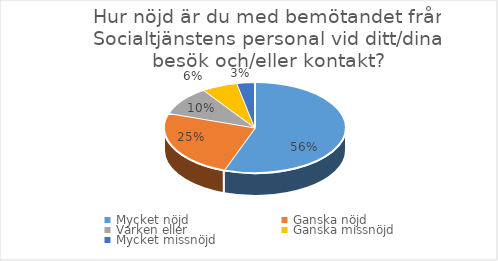
| Category | Series 0 |
|---|---|
| Mycket nöjd  | 70 |
| Ganska nöjd | 31 |
| Varken eller  | 13 |
| Ganska missnöjd | 8 |
| Mycket missnöjd  | 4 |